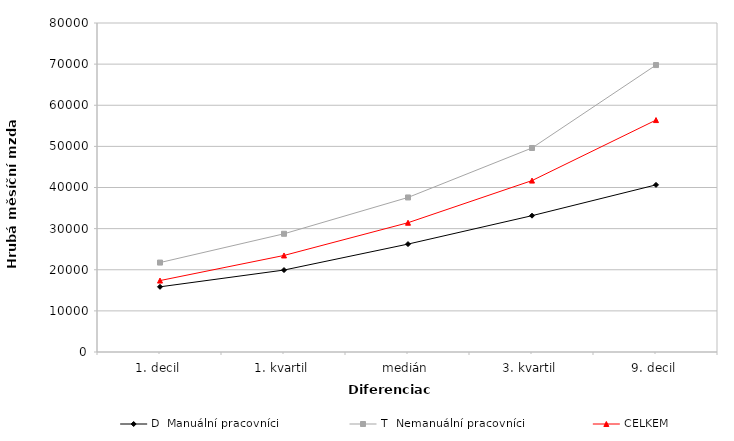
| Category | D  Manuální pracovníci | T  Nemanuální pracovníci | CELKEM |
|---|---|---|---|
| 1. decil | 15847.386 | 21744.922 | 17368.75 |
| 1. kvartil | 19926.73 | 28743.848 | 23474.676 |
| medián | 26241.784 | 37578.048 | 31433.92 |
| 3. kvartil | 33147.628 | 49605.789 | 41683.03 |
| 9. decil | 40638.12 | 69774.676 | 56397.257 |